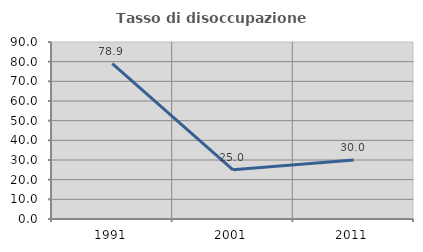
| Category | Tasso di disoccupazione giovanile  |
|---|---|
| 1991.0 | 78.947 |
| 2001.0 | 25 |
| 2011.0 | 30 |